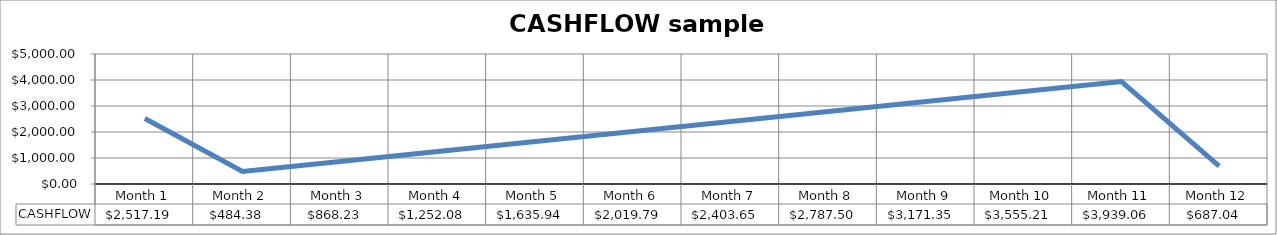
| Category | CASHFLOW |
|---|---|
| Month 1 | 2517.188 |
| Month 2 | 484.375 |
| Month 3 | 868.229 |
| Month 4 | 1252.083 |
| Month 5 | 1635.938 |
| Month 6 | 2019.792 |
| Month 7 | 2403.646 |
| Month 8 | 2787.5 |
| Month 9 | 3171.354 |
| Month 10 | 3555.208 |
| Month 11 | 3939.063 |
| Month 12 | 687.042 |